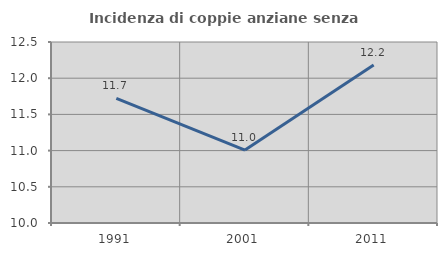
| Category | Incidenza di coppie anziane senza figli  |
|---|---|
| 1991.0 | 11.72 |
| 2001.0 | 11.007 |
| 2011.0 | 12.182 |